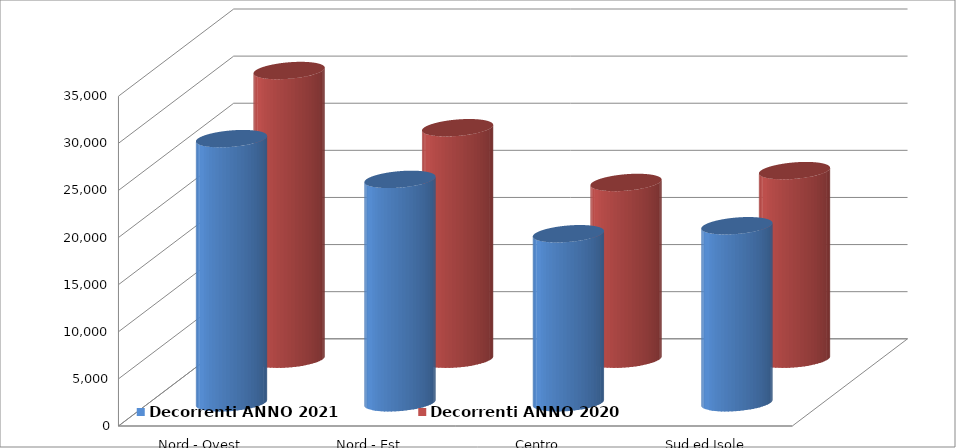
| Category | Decorrenti ANNO 2021 | Decorrenti ANNO 2020 |
|---|---|---|
| Nord - Ovest | 28033 | 30635 |
| Nord - Est | 23711 | 24566 |
| Centro | 17943 | 18757 |
| Sud ed Isole | 18790 | 20012 |